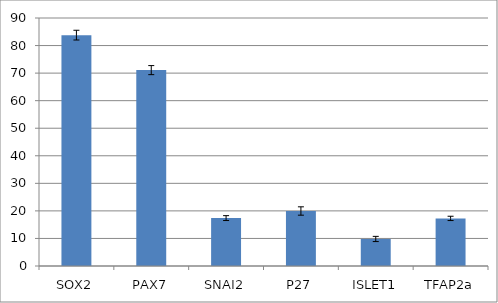
| Category | Series 0 |
|---|---|
| _x0004_SOX2 | 83.783 |
| _x0004_PAX7 | 71.085 |
| _x0005_SNAI2 | 17.386 |
| _x0003_P27 | 19.96 |
| _x0006_ISLET1 | 9.811 |
| _x0006_TFAP2a | 17.274 |